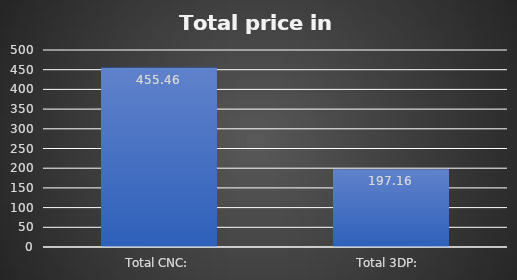
| Category | Series 0 |
|---|---|
| Total CNC: | 455.46 |
| Total 3DP:  | 197.16 |